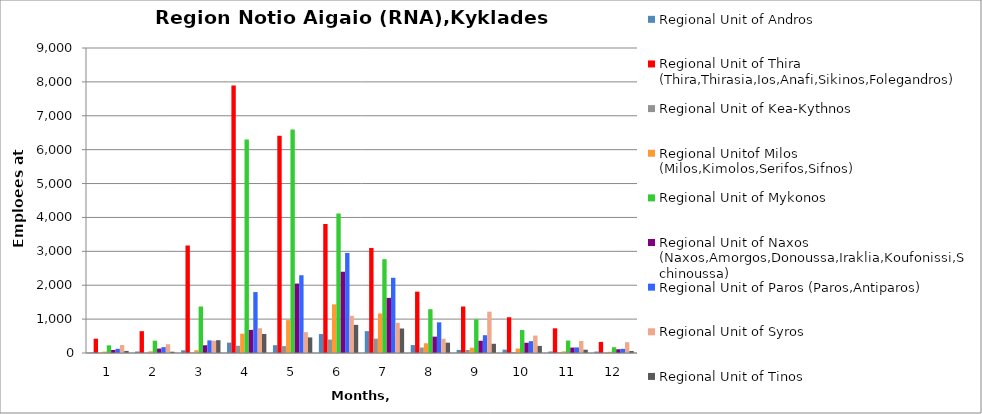
| Category | Regional Unit of Andros | Regional Unit of Thira (Thira,Thirasia,Ios,Anafi,Sikinos,Folegandros) | Regional Unit of Kea-Kythnos | Regional Unitof Milos  (Milos,Kimolos,Serifos,Sifnos) | Regional Unit of Mykonos | Regional Unit of Naxos (Naxos,Amorgos,Donoussa,Iraklia,Koufonissi,Schinoussa) | Regional Unit of Paros (Paros,Antiparos) | Regional Unit of Syros | Regional Unit of Tinos |
|---|---|---|---|---|---|---|---|---|---|
| 0 | 14 | 422 | 2 | 41 | 226 | 90 | 124 | 234 | 61 |
| 1 | 44 | 644 | 6 | 49 | 364 | 131 | 173 | 260 | 38 |
| 2 | 79 | 3172 | 9 | 81 | 1372 | 228 | 372 | 361 | 378 |
| 3 | 306 | 7892 | 214 | 569 | 6300 | 683 | 1798 | 732 | 562 |
| 4 | 230 | 6412 | 204 | 970 | 6592 | 2049 | 2294 | 614 | 460 |
| 5 | 559 | 3806 | 397 | 1436 | 4116 | 2398 | 2952 | 1099 | 831 |
| 6 | 645 | 3100 | 423 | 1166 | 2768 | 1627 | 2220 | 891 | 723 |
| 7 | 235 | 1810 | 161 | 286 | 1292 | 483 | 905 | 421 | 304 |
| 8 | 91 | 1372 | 89 | 156 | 994 | 361 | 525 | 1220 | 272 |
| 9 | 100 | 1056 | 24 | 132 | 679 | 301 | 349 | 514 | 209 |
| 10 | 45 | 729 | 12 | 49 | 367 | 160 | 165 | 354 | 97 |
| 11 | 43 | 327 | 10 | 37 | 171 | 110 | 124 | 318 | 58 |